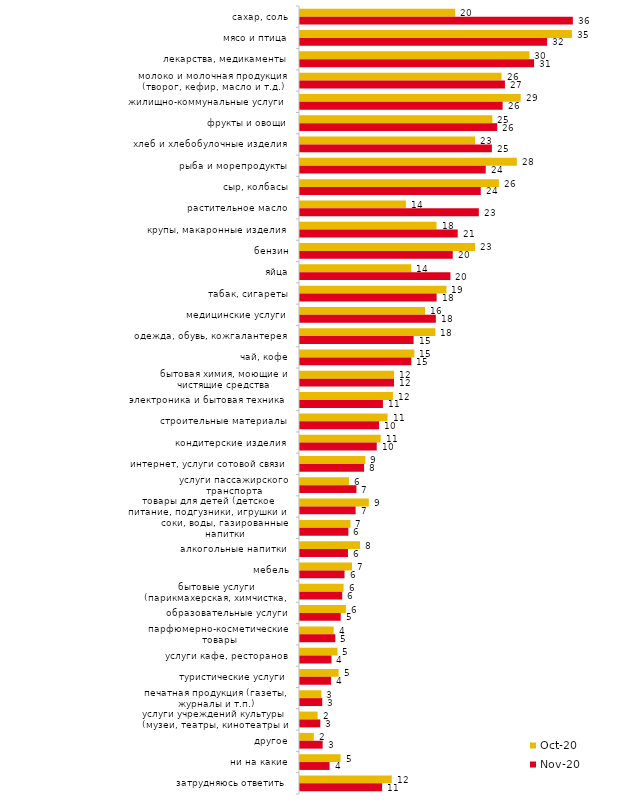
| Category | окт.20 | ноя.20 |
|---|---|---|
| сахар, соль | 20.229 | 35.55 |
| мясо и птица | 35.426 | 32.2 |
| лекарства, медикаменты | 29.895 | 30.5 |
| молоко и молочная продукция (творог, кефир, масло и т.д.) | 26.258 | 26.7 |
| жилищно-коммунальные услуги | 28.749 | 26.4 |
| фрукты и овощи | 25.062 | 25.7 |
| хлеб и хлебобулочные изделия | 22.82 | 25 |
| рыба и морепродукты | 28.251 | 24.2 |
| сыр, колбасы | 25.909 | 23.55 |
| растительное масло | 13.802 | 23.3 |
| крупы, макаронные изделия | 17.788 | 20.55 |
| бензин | 22.82 | 19.9 |
| яйца | 14.499 | 19.6 |
| табак, сигареты | 19.083 | 17.8 |
| медицинские услуги | 16.293 | 17.7 |
| одежда, обувь, кожгалантерея | 17.638 | 14.8 |
| чай, кофе | 14.898 | 14.5 |
| бытовая химия, моющие и чистящие средства | 12.257 | 12.25 |
| электроника и бытовая техника | 12.108 | 10.8 |
| строительные материалы | 11.41 | 10.3 |
| кондитерские изделия | 10.513 | 10 |
| интернет, услуги сотовой связи | 8.52 | 8.35 |
| услуги пассажирского транспорта | 6.378 | 7.35 |
| товары для детей (детское питание, подгузники, игрушки и т.п.) | 8.969 | 7.25 |
| соки, воды, газированные напитки | 6.577 | 6.3 |
| алкогольные напитки | 7.823 | 6.25 |
| мебель | 6.776 | 5.8 |
| бытовые услуги (парикмахерская, химчистка, ателье и т.д.) | 5.68 | 5.5 |
| образовательные услуги | 5.979 | 5.3 |
| парфюмерно-косметические товары | 4.385 | 4.6 |
| услуги кафе, ресторанов | 4.883 | 4.1 |
| туристические услуги | 5.032 | 4.05 |
| печатная продукция (газеты, журналы и т.п.) | 2.79 | 2.9 |
| услуги учреждений культуры (музеи, театры, кинотеатры и т.п.) | 2.292 | 2.65 |
| другое | 1.794 | 2.95 |
| ни на какие | 5.282 | 3.85 |
| затрудняюсь ответить | 11.958 | 10.7 |